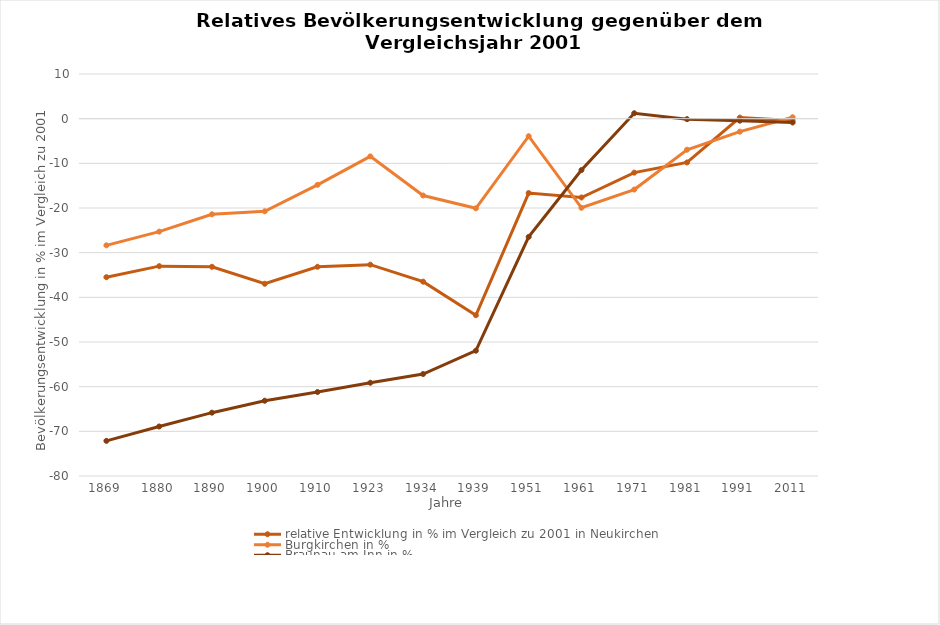
| Category | relative Entwicklung in % im Vergleich zu 2001 in Neukirchen  | Burgkirchen in % | Braunau am Inn in % |
|---|---|---|---|
| 1869.0 | -35.49 | -28.358 | -72.131 |
| 1880.0 | -33.016 | -25.295 | -68.917 |
| 1890.0 | -33.159 | -21.406 | -65.82 |
| 1900.0 | -36.965 | -20.738 | -63.145 |
| 1910.0 | -33.159 | -14.808 | -61.192 |
| 1923.0 | -32.683 | -8.445 | -59.123 |
| 1934.0 | -36.489 | -17.203 | -57.165 |
| 1939.0 | -44.006 | -20.071 | -51.95 |
| 1951.0 | -16.651 | -3.928 | -26.468 |
| 1961.0 | -17.65 | -19.953 | -11.508 |
| 1971.0 | -12.084 | -15.868 | 1.218 |
| 1981.0 | -9.8 | -6.952 | -0.116 |
| 1991.0 | 0.238 | -2.907 | -0.447 |
| 2011.0 | -0.428 | 0.314 | -0.857 |